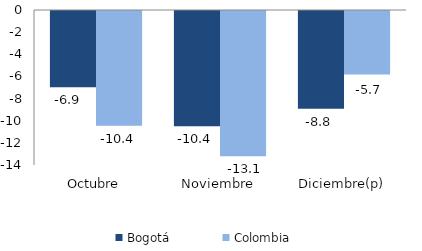
| Category | Bogotá | Colombia |
|---|---|---|
| Octubre | -6.894 | -10.355 |
| Noviembre | -10.413 | -13.122 |
| Diciembre(p) | -8.823 | -5.73 |